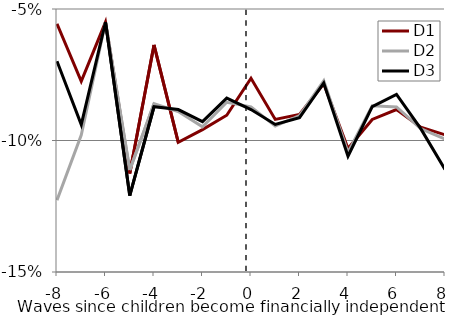
| Category | D1 | D2 | D3 |
|---|---|---|---|
| -8.0 | -0.056 | -0.123 | -0.07 |
| -7.0 | -0.077 | -0.098 | -0.094 |
| -6.0 | -0.055 | -0.055 | -0.055 |
| -5.0 | -0.113 | -0.111 | -0.121 |
| -4.0 | -0.064 | -0.086 | -0.087 |
| -3.0 | -0.101 | -0.089 | -0.088 |
| -2.0 | -0.096 | -0.095 | -0.093 |
| -1.0 | -0.09 | -0.085 | -0.084 |
| 0.0 | -0.076 | -0.087 | -0.088 |
| 1.0 | -0.092 | -0.095 | -0.094 |
| 2.0 | -0.09 | -0.091 | -0.091 |
| 3.0 | -0.078 | -0.077 | -0.078 |
| 4.0 | -0.103 | -0.105 | -0.106 |
| 5.0 | -0.092 | -0.087 | -0.087 |
| 6.0 | -0.088 | -0.087 | -0.082 |
| 7.0 | -0.095 | -0.095 | -0.095 |
| 8.0 | -0.098 | -0.099 | -0.111 |